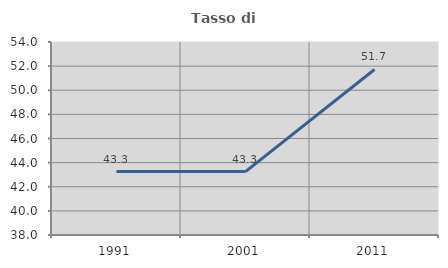
| Category | Tasso di occupazione   |
|---|---|
| 1991.0 | 43.258 |
| 2001.0 | 43.258 |
| 2011.0 | 51.724 |